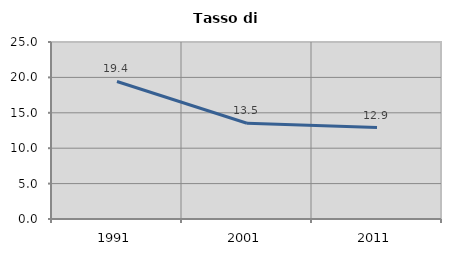
| Category | Tasso di disoccupazione   |
|---|---|
| 1991.0 | 19.426 |
| 2001.0 | 13.519 |
| 2011.0 | 12.924 |